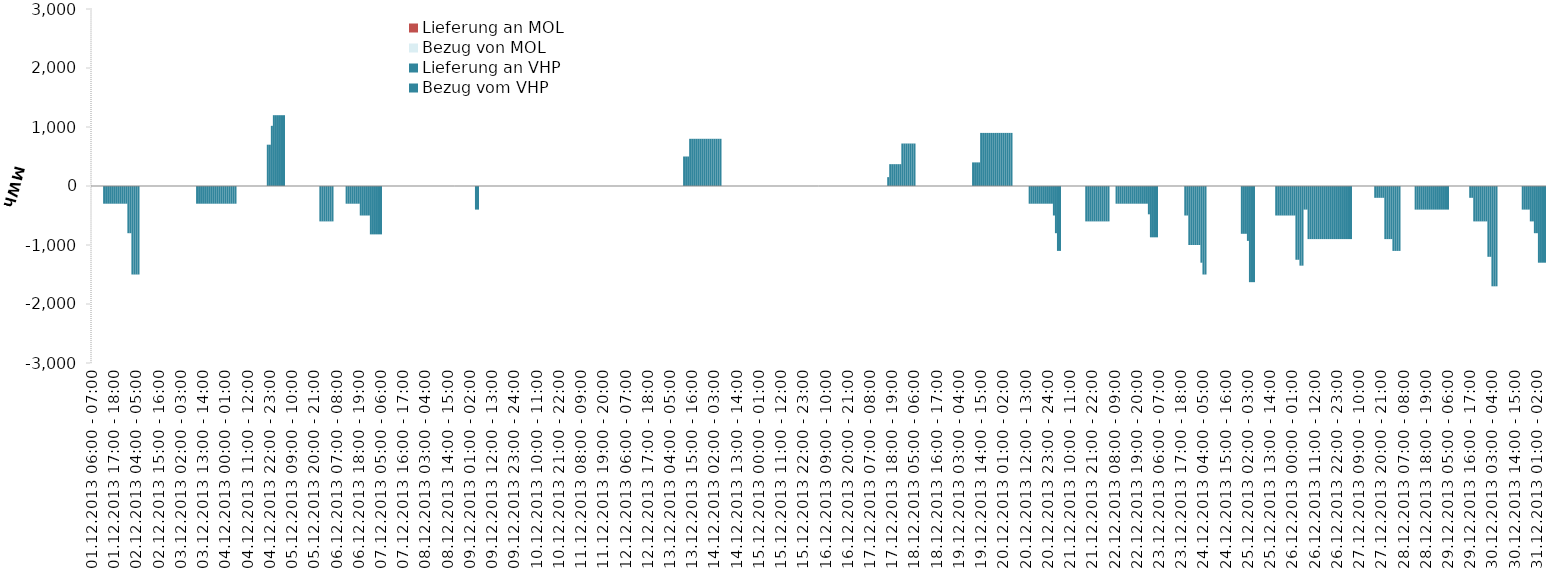
| Category | Bezug vom VHP | Lieferung an VHP | Bezug von MOL | Lieferung an MOL |
|---|---|---|---|---|
| 01.12.2013 06:00 - 07:00 | 0 | 0 | 0 | 0 |
| 01.12.2013 07:00 - 08:00 | 0 | 0 | 0 | 0 |
| 01.12.2013 08:00 - 09:00 | 0 | 0 | 0 | 0 |
| 01.12.2013 09:00 - 10:00 | 0 | 0 | 0 | 0 |
| 01.12.2013 10:00 - 11:00 | 0 | 0 | 0 | 0 |
| 01.12.2013 11:00 - 12:00 | 0 | 0 | 0 | 0 |
| 01.12.2013 12:00 - 13:00 | 0 | -300 | 0 | 0 |
| 01.12.2013 13:00 - 14:00 | 0 | -300 | 0 | 0 |
| 01.12.2013 14:00 - 15:00 | 0 | -300 | 0 | 0 |
| 01.12.2013 15:00 - 16:00 | 0 | -300 | 0 | 0 |
| 01.12.2013 16:00 - 17:00 | 0 | -300 | 0 | 0 |
| 01.12.2013 17:00 - 18:00 | 0 | -300 | 0 | 0 |
| 01.12.2013 18:00 - 19:00 | 0 | -300 | 0 | 0 |
| 01.12.2013 19:00 - 20:00 | 0 | -300 | 0 | 0 |
| 01.12.2013 20:00 - 21:00 | 0 | -300 | 0 | 0 |
| 01.12.2013 21:00 - 22:00 | 0 | -300 | 0 | 0 |
| 01.12.2013 22:00 - 23:00 | 0 | -300 | 0 | 0 |
| 01.12.2013 23:00 - 24:00 | 0 | -300 | 0 | 0 |
| 02.12.2013 00:00 - 01:00 | 0 | -800 | 0 | 0 |
| 02.12.2013 01:00 - 02:00 | 0 | -800 | 0 | 0 |
| 02.12.2013 02:00 - 03:00 | 0 | -1500 | 0 | 0 |
| 02.12.2013 03:00 - 04:00 | 0 | -1500 | 0 | 0 |
| 02.12.2013 04:00 - 05:00 | 0 | -1500 | 0 | 0 |
| 02.12.2013 05:00 - 06:00 | 0 | -1500 | 0 | 0 |
| 02.12.2013 06:00 - 07:00 | 0 | 0 | 0 | 0 |
| 02.12.2013 07:00 - 08:00 | 0 | 0 | 0 | 0 |
| 02.12.2013 08:00 - 09:00 | 0 | 0 | 0 | 0 |
| 02.12.2013 09:00 - 10:00 | 0 | 0 | 0 | 0 |
| 02.12.2013 10:00 - 11:00 | 0 | 0 | 0 | 0 |
| 02.12.2013 11:00 - 12:00 | 0 | 0 | 0 | 0 |
| 02.12.2013 12:00 - 13:00 | 0 | 0 | 0 | 0 |
| 02.12.2013 13:00 - 14:00 | 0 | 0 | 0 | 0 |
| 02.12.2013 14:00 - 15:00 | 0 | 0 | 0 | 0 |
| 02.12.2013 15:00 - 16:00 | 0 | 0 | 0 | 0 |
| 02.12.2013 16:00 - 17:00 | 0 | 0 | 0 | 0 |
| 02.12.2013 17:00 - 18:00 | 0 | 0 | 0 | 0 |
| 02.12.2013 18:00 - 19:00 | 0 | 0 | 0 | 0 |
| 02.12.2013 19:00 - 20:00 | 0 | 0 | 0 | 0 |
| 02.12.2013 20:00 - 21:00 | 0 | 0 | 0 | 0 |
| 02.12.2013 21:00 - 22:00 | 0 | 0 | 0 | 0 |
| 02.12.2013 22:00 - 23:00 | 0 | 0 | 0 | 0 |
| 02.12.2013 23:00 - 24:00 | 0 | 0 | 0 | 0 |
| 03.12.2013 00:00 - 01:00 | 0 | 0 | 0 | 0 |
| 03.12.2013 01:00 - 02:00 | 0 | 0 | 0 | 0 |
| 03.12.2013 02:00 - 03:00 | 0 | 0 | 0 | 0 |
| 03.12.2013 03:00 - 04:00 | 0 | 0 | 0 | 0 |
| 03.12.2013 04:00 - 05:00 | 0 | 0 | 0 | 0 |
| 03.12.2013 05:00 - 06:00 | 0 | 0 | 0 | 0 |
| 03.12.2013 06:00 - 07:00 | 0 | 0 | 0 | 0 |
| 03.12.2013 07:00 - 08:00 | 0 | 0 | 0 | 0 |
| 03.12.2013 08:00 - 09:00 | 0 | 0 | 0 | 0 |
| 03.12.2013 09:00 - 10:00 | 0 | 0 | 0 | 0 |
| 03.12.2013 10:00 - 11:00 | 0 | -300 | 0 | 0 |
| 03.12.2013 11:00 - 12:00 | 0 | -300 | 0 | 0 |
| 03.12.2013 12:00 - 13:00 | 0 | -300 | 0 | 0 |
| 03.12.2013 13:00 - 14:00 | 0 | -300 | 0 | 0 |
| 03.12.2013 14:00 - 15:00 | 0 | -300 | 0 | 0 |
| 03.12.2013 15:00 - 16:00 | 0 | -300 | 0 | 0 |
| 03.12.2013 16:00 - 17:00 | 0 | -300 | 0 | 0 |
| 03.12.2013 17:00 - 18:00 | 0 | -300 | 0 | 0 |
| 03.12.2013 18:00 - 19:00 | 0 | -300 | 0 | 0 |
| 03.12.2013 19:00 - 20:00 | 0 | -300 | 0 | 0 |
| 03.12.2013 20:00 - 21:00 | 0 | -300 | 0 | 0 |
| 03.12.2013 21:00 - 22:00 | 0 | -300 | 0 | 0 |
| 03.12.2013 22:00 - 23:00 | 0 | -300 | 0 | 0 |
| 03.12.2013 23:00 - 24:00 | 0 | -300 | 0 | 0 |
| 04.12.2013 00:00 - 01:00 | 0 | -300 | 0 | 0 |
| 04.12.2013 01:00 - 02:00 | 0 | -300 | 0 | 0 |
| 04.12.2013 02:00 - 03:00 | 0 | -300 | 0 | 0 |
| 04.12.2013 03:00 - 04:00 | 0 | -300 | 0 | 0 |
| 04.12.2013 04:00 - 05:00 | 0 | -300 | 0 | 0 |
| 04.12.2013 05:00 - 06:00 | 0 | -300 | 0 | 0 |
| 04.12.2013 06:00 - 07:00 | 0 | 0 | 0 | 0 |
| 04.12.2013 07:00 - 08:00 | 0 | 0 | 0 | 0 |
| 04.12.2013 08:00 - 09:00 | 0 | 0 | 0 | 0 |
| 04.12.2013 09:00 - 10:00 | 0 | 0 | 0 | 0 |
| 04.12.2013 10:00 - 11:00 | 0 | 0 | 0 | 0 |
| 04.12.2013 11:00 - 12:00 | 0 | 0 | 0 | 0 |
| 04.12.2013 12:00 - 13:00 | 0 | 0 | 0 | 0 |
| 04.12.2013 13:00 - 14:00 | 0 | 0 | 0 | 0 |
| 04.12.2013 14:00 - 15:00 | 0 | 0 | 0 | 0 |
| 04.12.2013 15:00 - 16:00 | 0 | 0 | 0 | 0 |
| 04.12.2013 16:00 - 17:00 | 0 | 0 | 0 | 0 |
| 04.12.2013 17:00 - 18:00 | 0 | 0 | 0 | 0 |
| 04.12.2013 18:00 - 19:00 | 0 | 0 | 0 | 0 |
| 04.12.2013 19:00 - 20:00 | 0 | 0 | 0 | 0 |
| 04.12.2013 20:00 - 21:00 | 0 | 0 | 0 | 0 |
| 04.12.2013 21:00 - 22:00 | 700 | 0 | 0 | 0 |
| 04.12.2013 22:00 - 23:00 | 700 | 0 | 0 | 0 |
| 04.12.2013 23:00 - 24:00 | 1020 | 0 | 0 | 0 |
| 05.12.2013 00:00 - 01:00 | 1200 | 0 | 0 | 0 |
| 05.12.2013 01:00 - 02:00 | 1200 | 0 | 0 | 0 |
| 05.12.2013 02:00 - 03:00 | 1200 | 0 | 0 | 0 |
| 05.12.2013 03:00 - 04:00 | 1200 | 0 | 0 | 0 |
| 05.12.2013 04:00 - 05:00 | 1200 | 0 | 0 | 0 |
| 05.12.2013 05:00 - 06:00 | 1200 | 0 | 0 | 0 |
| 05.12.2013 06:00 - 07:00 | 0 | 0 | 0 | 0 |
| 05.12.2013 07:00 - 08:00 | 0 | 0 | 0 | 0 |
| 05.12.2013 08:00 - 09:00 | 0 | 0 | 0 | 0 |
| 05.12.2013 09:00 - 10:00 | 0 | 0 | 0 | 0 |
| 05.12.2013 10:00 - 11:00 | 0 | 0 | 0 | 0 |
| 05.12.2013 11:00 - 12:00 | 0 | 0 | 0 | 0 |
| 05.12.2013 12:00 - 13:00 | 0 | 0 | 0 | 0 |
| 05.12.2013 13:00 - 14:00 | 0 | 0 | 0 | 0 |
| 05.12.2013 14:00 - 15:00 | 0 | 0 | 0 | 0 |
| 05.12.2013 15:00 - 16:00 | 0 | 0 | 0 | 0 |
| 05.12.2013 16:00 - 17:00 | 0 | 0 | 0 | 0 |
| 05.12.2013 17:00 - 18:00 | 0 | 0 | 0 | 0 |
| 05.12.2013 18:00 - 19:00 | 0 | 0 | 0 | 0 |
| 05.12.2013 19:00 - 20:00 | 0 | 0 | 0 | 0 |
| 05.12.2013 20:00 - 21:00 | 0 | 0 | 0 | 0 |
| 05.12.2013 21:00 - 22:00 | 0 | 0 | 0 | 0 |
| 05.12.2013 22:00 - 23:00 | 0 | 0 | 0 | 0 |
| 05.12.2013 23:00 - 24:00 | 0 | -600 | 0 | 0 |
| 06.12.2013 00:00 - 01:00 | 0 | -600 | 0 | 0 |
| 06.12.2013 01:00 - 02:00 | 0 | -600 | 0 | 0 |
| 06.12.2013 02:00 - 03:00 | 0 | -600 | 0 | 0 |
| 06.12.2013 03:00 - 04:00 | 0 | -600 | 0 | 0 |
| 06.12.2013 04:00 - 05:00 | 0 | -600 | 0 | 0 |
| 06.12.2013 05:00 - 06:00 | 0 | -600 | 0 | 0 |
| 06.12.2013 06:00 - 07:00 | 0 | 0 | 0 | 0 |
| 06.12.2013 07:00 - 08:00 | 0 | 0 | 0 | 0 |
| 06.12.2013 08:00 - 09:00 | 0 | 0 | 0 | 0 |
| 06.12.2013 09:00 - 10:00 | 0 | 0 | 0 | 0 |
| 06.12.2013 10:00 - 11:00 | 0 | 0 | 0 | 0 |
| 06.12.2013 11:00 - 12:00 | 0 | 0 | 0 | 0 |
| 06.12.2013 12:00 - 13:00 | 0 | -300 | 0 | 0 |
| 06.12.2013 13:00 - 14:00 | 0 | -300 | 0 | 0 |
| 06.12.2013 14:00 - 15:00 | 0 | -300 | 0 | 0 |
| 06.12.2013 15:00 - 16:00 | 0 | -300 | 0 | 0 |
| 06.12.2013 16:00 - 17:00 | 0 | -300 | 0 | 0 |
| 06.12.2013 17:00 - 18:00 | 0 | -300 | 0 | 0 |
| 06.12.2013 18:00 - 19:00 | 0 | -300 | 0 | 0 |
| 06.12.2013 19:00 - 20:00 | 0 | -500 | 0 | 0 |
| 06.12.2013 20:00 - 21:00 | 0 | -500 | 0 | 0 |
| 06.12.2013 21:00 - 22:00 | 0 | -500 | 0 | 0 |
| 06.12.2013 22:00 - 23:00 | 0 | -500 | 0 | 0 |
| 06.12.2013 23:00 - 24:00 | 0 | -500 | 0 | 0 |
| 07.12.2013 00:00 - 01:00 | 0 | -820 | 0 | 0 |
| 07.12.2013 01:00 - 02:00 | 0 | -820 | 0 | 0 |
| 07.12.2013 02:00 - 03:00 | 0 | -820 | 0 | 0 |
| 07.12.2013 03:00 - 04:00 | 0 | -820 | 0 | 0 |
| 07.12.2013 04:00 - 05:00 | 0 | -820 | 0 | 0 |
| 07.12.2013 05:00 - 06:00 | 0 | -820 | 0 | 0 |
| 07.12.2013 06:00 - 07:00 | 0 | 0 | 0 | 0 |
| 07.12.2013 07:00 - 08:00 | 0 | 0 | 0 | 0 |
| 07.12.2013 08:00 - 09:00 | 0 | 0 | 0 | 0 |
| 07.12.2013 09:00 - 10:00 | 0 | 0 | 0 | 0 |
| 07.12.2013 10:00 - 11:00 | 0 | 0 | 0 | 0 |
| 07.12.2013 11:00 - 12:00 | 0 | 0 | 0 | 0 |
| 07.12.2013 12:00 - 13:00 | 0 | 0 | 0 | 0 |
| 07.12.2013 13:00 - 14:00 | 0 | 0 | 0 | 0 |
| 07.12.2013 14:00 - 15:00 | 0 | 0 | 0 | 0 |
| 07.12.2013 15:00 - 16:00 | 0 | 0 | 0 | 0 |
| 07.12.2013 16:00 - 17:00 | 0 | 0 | 0 | 0 |
| 07.12.2013 17:00 - 18:00 | 0 | 0 | 0 | 0 |
| 07.12.2013 18:00 - 19:00 | 0 | 0 | 0 | 0 |
| 07.12.2013 19:00 - 20:00 | 0 | 0 | 0 | 0 |
| 07.12.2013 20:00 - 21:00 | 0 | 0 | 0 | 0 |
| 07.12.2013 21:00 - 22:00 | 0 | 0 | 0 | 0 |
| 07.12.2013 22:00 - 23:00 | 0 | 0 | 0 | 0 |
| 07.12.2013 23:00 - 24:00 | 0 | 0 | 0 | 0 |
| 08.12.2013 00:00 - 01:00 | 0 | 0 | 0 | 0 |
| 08.12.2013 01:00 - 02:00 | 0 | 0 | 0 | 0 |
| 08.12.2013 02:00 - 03:00 | 0 | 0 | 0 | 0 |
| 08.12.2013 03:00 - 04:00 | 0 | 0 | 0 | 0 |
| 08.12.2013 04:00 - 05:00 | 0 | 0 | 0 | 0 |
| 08.12.2013 05:00 - 06:00 | 0 | 0 | 0 | 0 |
| 08.12.2013 06:00 - 07:00 | 0 | 0 | 0 | 0 |
| 08.12.2013 07:00 - 08:00 | 0 | 0 | 0 | 0 |
| 08.12.2013 08:00 - 09:00 | 0 | 0 | 0 | 0 |
| 08.12.2013 09:00 - 10:00 | 0 | 0 | 0 | 0 |
| 08.12.2013 10:00 - 11:00 | 0 | 0 | 0 | 0 |
| 08.12.2013 11:00 - 12:00 | 0 | 0 | 0 | 0 |
| 08.12.2013 12:00 - 13:00 | 0 | 0 | 0 | 0 |
| 08.12.2013 13:00 - 14:00 | 0 | 0 | 0 | 0 |
| 08.12.2013 14:00 - 15:00 | 0 | 0 | 0 | 0 |
| 08.12.2013 15:00 - 16:00 | 0 | 0 | 0 | 0 |
| 08.12.2013 16:00 - 17:00 | 0 | 0 | 0 | 0 |
| 08.12.2013 17:00 - 18:00 | 0 | 0 | 0 | 0 |
| 08.12.2013 18:00 - 19:00 | 0 | 0 | 0 | 0 |
| 08.12.2013 19:00 - 20:00 | 0 | 0 | 0 | 0 |
| 08.12.2013 20:00 - 21:00 | 0 | 0 | 0 | 0 |
| 08.12.2013 21:00 - 22:00 | 0 | 0 | 0 | 0 |
| 08.12.2013 22:00 - 23:00 | 0 | 0 | 0 | 0 |
| 08.12.2013 23:00 - 24:00 | 0 | 0 | 0 | 0 |
| 09.12.2013 00:00 - 01:00 | 0 | 0 | 0 | 0 |
| 09.12.2013 01:00 - 02:00 | 0 | 0 | 0 | 0 |
| 09.12.2013 02:00 - 03:00 | 0 | 0 | 0 | 0 |
| 09.12.2013 03:00 - 04:00 | 0 | 0 | 0 | 0 |
| 09.12.2013 04:00 - 05:00 | 0 | -400 | 0 | 0 |
| 09.12.2013 05:00 - 06:00 | 0 | -400 | 0 | 0 |
| 09.12.2013 06:00 - 07:00 | 0 | 0 | 0 | 0 |
| 09.12.2013 07:00 - 08:00 | 0 | 0 | 0 | 0 |
| 09.12.2013 08:00 - 09:00 | 0 | 0 | 0 | 0 |
| 09.12.2013 09:00 - 10:00 | 0 | 0 | 0 | 0 |
| 09.12.2013 10:00 - 11:00 | 0 | 0 | 0 | 0 |
| 09.12.2013 11:00 - 12:00 | 0 | 0 | 0 | 0 |
| 09.12.2013 12:00 - 13:00 | 0 | 0 | 0 | 0 |
| 09.12.2013 13:00 - 14:00 | 0 | 0 | 0 | 0 |
| 09.12.2013 14:00 - 15:00 | 0 | 0 | 0 | 0 |
| 09.12.2013 15:00 - 16:00 | 0 | 0 | 0 | 0 |
| 09.12.2013 16:00 - 17:00 | 0 | 0 | 0 | 0 |
| 09.12.2013 17:00 - 18:00 | 0 | 0 | 0 | 0 |
| 09.12.2013 18:00 - 19:00 | 0 | 0 | 0 | 0 |
| 09.12.2013 19:00 - 20:00 | 0 | 0 | 0 | 0 |
| 09.12.2013 20:00 - 21:00 | 0 | 0 | 0 | 0 |
| 09.12.2013 21:00 - 22:00 | 0 | 0 | 0 | 0 |
| 09.12.2013 22:00 - 23:00 | 0 | 0 | 0 | 0 |
| 09.12.2013 23:00 - 24:00 | 0 | 0 | 0 | 0 |
| 10.12.2013 00:00 - 01:00 | 0 | 0 | 0 | 0 |
| 10.12.2013 01:00 - 02:00 | 0 | 0 | 0 | 0 |
| 10.12.2013 02:00 - 03:00 | 0 | 0 | 0 | 0 |
| 10.12.2013 03:00 - 04:00 | 0 | 0 | 0 | 0 |
| 10.12.2013 04:00 - 05:00 | 0 | 0 | 0 | 0 |
| 10.12.2013 05:00 - 06:00 | 0 | 0 | 0 | 0 |
| 10.12.2013 06:00 - 07:00 | 0 | 0 | 0 | 0 |
| 10.12.2013 07:00 - 08:00 | 0 | 0 | 0 | 0 |
| 10.12.2013 08:00 - 09:00 | 0 | 0 | 0 | 0 |
| 10.12.2013 09:00 - 10:00 | 0 | 0 | 0 | 0 |
| 10.12.2013 10:00 - 11:00 | 0 | 0 | 0 | 0 |
| 10.12.2013 11:00 - 12:00 | 0 | 0 | 0 | 0 |
| 10.12.2013 12:00 - 13:00 | 0 | 0 | 0 | 0 |
| 10.12.2013 13:00 - 14:00 | 0 | 0 | 0 | 0 |
| 10.12.2013 14:00 - 15:00 | 0 | 0 | 0 | 0 |
| 10.12.2013 15:00 - 16:00 | 0 | 0 | 0 | 0 |
| 10.12.2013 16:00 - 17:00 | 0 | 0 | 0 | 0 |
| 10.12.2013 17:00 - 18:00 | 0 | 0 | 0 | 0 |
| 10.12.2013 18:00 - 19:00 | 0 | 0 | 0 | 0 |
| 10.12.2013 19:00 - 20:00 | 0 | 0 | 0 | 0 |
| 10.12.2013 20:00 - 21:00 | 0 | 0 | 0 | 0 |
| 10.12.2013 21:00 - 22:00 | 0 | 0 | 0 | 0 |
| 10.12.2013 22:00 - 23:00 | 0 | 0 | 0 | 0 |
| 10.12.2013 23:00 - 24:00 | 0 | 0 | 0 | 0 |
| 11.12.2013 00:00 - 01:00 | 0 | 0 | 0 | 0 |
| 11.12.2013 01:00 - 02:00 | 0 | 0 | 0 | 0 |
| 11.12.2013 02:00 - 03:00 | 0 | 0 | 0 | 0 |
| 11.12.2013 03:00 - 04:00 | 0 | 0 | 0 | 0 |
| 11.12.2013 04:00 - 05:00 | 0 | 0 | 0 | 0 |
| 11.12.2013 05:00 - 06:00 | 0 | 0 | 0 | 0 |
| 11.12.2013 06:00 - 07:00 | 0 | 0 | 0 | 0 |
| 11.12.2013 07:00 - 08:00 | 0 | 0 | 0 | 0 |
| 11.12.2013 08:00 - 09:00 | 0 | 0 | 0 | 0 |
| 11.12.2013 09:00 - 10:00 | 0 | 0 | 0 | 0 |
| 11.12.2013 10:00 - 11:00 | 0 | 0 | 0 | 0 |
| 11.12.2013 11:00 - 12:00 | 0 | 0 | 0 | 0 |
| 11.12.2013 12:00 - 13:00 | 0 | 0 | 0 | 0 |
| 11.12.2013 13:00 - 14:00 | 0 | 0 | 0 | 0 |
| 11.12.2013 14:00 - 15:00 | 0 | 0 | 0 | 0 |
| 11.12.2013 15:00 - 16:00 | 0 | 0 | 0 | 0 |
| 11.12.2013 16:00 - 17:00 | 0 | 0 | 0 | 0 |
| 11.12.2013 17:00 - 18:00 | 0 | 0 | 0 | 0 |
| 11.12.2013 18:00 - 19:00 | 0 | 0 | 0 | 0 |
| 11.12.2013 19:00 - 20:00 | 0 | 0 | 0 | 0 |
| 11.12.2013 20:00 - 21:00 | 0 | 0 | 0 | 0 |
| 11.12.2013 21:00 - 22:00 | 0 | 0 | 0 | 0 |
| 11.12.2013 22:00 - 23:00 | 0 | 0 | 0 | 0 |
| 11.12.2013 23:00 - 24:00 | 0 | 0 | 0 | 0 |
| 12.12.2013 00:00 - 01:00 | 0 | 0 | 0 | 0 |
| 12.12.2013 01:00 - 02:00 | 0 | 0 | 0 | 0 |
| 12.12.2013 02:00 - 03:00 | 0 | 0 | 0 | 0 |
| 12.12.2013 03:00 - 04:00 | 0 | 0 | 0 | 0 |
| 12.12.2013 04:00 - 05:00 | 0 | 0 | 0 | 0 |
| 12.12.2013 05:00 - 06:00 | 0 | 0 | 0 | 0 |
| 12.12.2013 06:00 - 07:00 | 0 | 0 | 0 | 0 |
| 12.12.2013 07:00 - 08:00 | 0 | 0 | 0 | 0 |
| 12.12.2013 08:00 - 09:00 | 0 | 0 | 0 | 0 |
| 12.12.2013 09:00 - 10:00 | 0 | 0 | 0 | 0 |
| 12.12.2013 10:00 - 11:00 | 0 | 0 | 0 | 0 |
| 12.12.2013 11:00 - 12:00 | 0 | 0 | 0 | 0 |
| 12.12.2013 12:00 - 13:00 | 0 | 0 | 0 | 0 |
| 12.12.2013 13:00 - 14:00 | 0 | 0 | 0 | 0 |
| 12.12.2013 14:00 - 15:00 | 0 | 0 | 0 | 0 |
| 12.12.2013 15:00 - 16:00 | 0 | 0 | 0 | 0 |
| 12.12.2013 16:00 - 17:00 | 0 | 0 | 0 | 0 |
| 12.12.2013 17:00 - 18:00 | 0 | 0 | 0 | 0 |
| 12.12.2013 18:00 - 19:00 | 0 | 0 | 0 | 0 |
| 12.12.2013 19:00 - 20:00 | 0 | 0 | 0 | 0 |
| 12.12.2013 20:00 - 21:00 | 0 | 0 | 0 | 0 |
| 12.12.2013 21:00 - 22:00 | 0 | 0 | 0 | 0 |
| 12.12.2013 22:00 - 23:00 | 0 | 0 | 0 | 0 |
| 12.12.2013 23:00 - 24:00 | 0 | 0 | 0 | 0 |
| 13.12.2013 00:00 - 01:00 | 0 | 0 | 0 | 0 |
| 13.12.2013 01:00 - 02:00 | 0 | 0 | 0 | 0 |
| 13.12.2013 02:00 - 03:00 | 0 | 0 | 0 | 0 |
| 13.12.2013 03:00 - 04:00 | 0 | 0 | 0 | 0 |
| 13.12.2013 04:00 - 05:00 | 0 | 0 | 0 | 0 |
| 13.12.2013 05:00 - 06:00 | 0 | 0 | 0 | 0 |
| 13.12.2013 06:00 - 07:00 | 0 | 0 | 0 | 0 |
| 13.12.2013 07:00 - 08:00 | 0 | 0 | 0 | 0 |
| 13.12.2013 08:00 - 09:00 | 0 | 0 | 0 | 0 |
| 13.12.2013 09:00 - 10:00 | 0 | 0 | 0 | 0 |
| 13.12.2013 10:00 - 11:00 | 0 | 0 | 0 | 0 |
| 13.12.2013 11:00 - 12:00 | 500 | 0 | 0 | 0 |
| 13.12.2013 12:00 - 13:00 | 500 | 0 | 0 | 0 |
| 13.12.2013 13:00 - 14:00 | 500 | 0 | 0 | 0 |
| 13.12.2013 14:00 - 15:00 | 800 | 0 | 0 | 0 |
| 13.12.2013 15:00 - 16:00 | 800 | 0 | 0 | 0 |
| 13.12.2013 16:00 - 17:00 | 800 | 0 | 0 | 0 |
| 13.12.2013 17:00 - 18:00 | 800 | 0 | 0 | 0 |
| 13.12.2013 18:00 - 19:00 | 800 | 0 | 0 | 0 |
| 13.12.2013 19:00 - 20:00 | 800 | 0 | 0 | 0 |
| 13.12.2013 20:00 - 21:00 | 800 | 0 | 0 | 0 |
| 13.12.2013 21:00 - 22:00 | 800 | 0 | 0 | 0 |
| 13.12.2013 22:00 - 23:00 | 800 | 0 | 0 | 0 |
| 13.12.2013 23:00 - 24:00 | 800 | 0 | 0 | 0 |
| 14.12.2013 00:00 - 01:00 | 800 | 0 | 0 | 0 |
| 14.12.2013 01:00 - 02:00 | 800 | 0 | 0 | 0 |
| 14.12.2013 02:00 - 03:00 | 800 | 0 | 0 | 0 |
| 14.12.2013 03:00 - 04:00 | 800 | 0 | 0 | 0 |
| 14.12.2013 04:00 - 05:00 | 800 | 0 | 0 | 0 |
| 14.12.2013 05:00 - 06:00 | 800 | 0 | 0 | 0 |
| 14.12.2013 06:00 - 07:00 | 0 | 0 | 0 | 0 |
| 14.12.2013 07:00 - 08:00 | 0 | 0 | 0 | 0 |
| 14.12.2013 08:00 - 09:00 | 0 | 0 | 0 | 0 |
| 14.12.2013 09:00 - 10:00 | 0 | 0 | 0 | 0 |
| 14.12.2013 10:00 - 11:00 | 0 | 0 | 0 | 0 |
| 14.12.2013 11:00 - 12:00 | 0 | 0 | 0 | 0 |
| 14.12.2013 12:00 - 13:00 | 0 | 0 | 0 | 0 |
| 14.12.2013 13:00 - 14:00 | 0 | 0 | 0 | 0 |
| 14.12.2013 14:00 - 15:00 | 0 | 0 | 0 | 0 |
| 14.12.2013 15:00 - 16:00 | 0 | 0 | 0 | 0 |
| 14.12.2013 16:00 - 17:00 | 0 | 0 | 0 | 0 |
| 14.12.2013 17:00 - 18:00 | 0 | 0 | 0 | 0 |
| 14.12.2013 18:00 - 19:00 | 0 | 0 | 0 | 0 |
| 14.12.2013 19:00 - 20:00 | 0 | 0 | 0 | 0 |
| 14.12.2013 20:00 - 21:00 | 0 | 0 | 0 | 0 |
| 14.12.2013 21:00 - 22:00 | 0 | 0 | 0 | 0 |
| 14.12.2013 22:00 - 23:00 | 0 | 0 | 0 | 0 |
| 14.12.2013 23:00 - 24:00 | 0 | 0 | 0 | 0 |
| 15.12.2013 00:00 - 01:00 | 0 | 0 | 0 | 0 |
| 15.12.2013 01:00 - 02:00 | 0 | 0 | 0 | 0 |
| 15.12.2013 02:00 - 03:00 | 0 | 0 | 0 | 0 |
| 15.12.2013 03:00 - 04:00 | 0 | 0 | 0 | 0 |
| 15.12.2013 04:00 - 05:00 | 0 | 0 | 0 | 0 |
| 15.12.2013 05:00 - 06:00 | 0 | 0 | 0 | 0 |
| 15.12.2013 06:00 - 07:00 | 0 | 0 | 0 | 0 |
| 15.12.2013 07:00 - 08:00 | 0 | 0 | 0 | 0 |
| 15.12.2013 08:00 - 09:00 | 0 | 0 | 0 | 0 |
| 15.12.2013 09:00 - 10:00 | 0 | 0 | 0 | 0 |
| 15.12.2013 10:00 - 11:00 | 0 | 0 | 0 | 0 |
| 15.12.2013 11:00 - 12:00 | 0 | 0 | 0 | 0 |
| 15.12.2013 12:00 - 13:00 | 0 | 0 | 0 | 0 |
| 15.12.2013 13:00 - 14:00 | 0 | 0 | 0 | 0 |
| 15.12.2013 14:00 - 15:00 | 0 | 0 | 0 | 0 |
| 15.12.2013 15:00 - 16:00 | 0 | 0 | 0 | 0 |
| 15.12.2013 16:00 - 17:00 | 0 | 0 | 0 | 0 |
| 15.12.2013 17:00 - 18:00 | 0 | 0 | 0 | 0 |
| 15.12.2013 18:00 - 19:00 | 0 | 0 | 0 | 0 |
| 15.12.2013 19:00 - 20:00 | 0 | 0 | 0 | 0 |
| 15.12.2013 20:00 - 21:00 | 0 | 0 | 0 | 0 |
| 15.12.2013 21:00 - 22:00 | 0 | 0 | 0 | 0 |
| 15.12.2013 22:00 - 23:00 | 0 | 0 | 0 | 0 |
| 15.12.2013 23:00 - 24:00 | 0 | 0 | 0 | 0 |
| 16.12.2013 00:00 - 01:00 | 0 | 0 | 0 | 0 |
| 16.12.2013 01:00 - 02:00 | 0 | 0 | 0 | 0 |
| 16.12.2013 02:00 - 03:00 | 0 | 0 | 0 | 0 |
| 16.12.2013 03:00 - 04:00 | 0 | 0 | 0 | 0 |
| 16.12.2013 04:00 - 05:00 | 0 | 0 | 0 | 0 |
| 16.12.2013 05:00 - 06:00 | 0 | 0 | 0 | 0 |
| 16.12.2013 06:00 - 07:00 | 0 | 0 | 0 | 0 |
| 16.12.2013 07:00 - 08:00 | 0 | 0 | 0 | 0 |
| 16.12.2013 08:00 - 09:00 | 0 | 0 | 0 | 0 |
| 16.12.2013 09:00 - 10:00 | 0 | 0 | 0 | 0 |
| 16.12.2013 10:00 - 11:00 | 0 | 0 | 0 | 0 |
| 16.12.2013 11:00 - 12:00 | 0 | 0 | 0 | 0 |
| 16.12.2013 12:00 - 13:00 | 0 | 0 | 0 | 0 |
| 16.12.2013 13:00 - 14:00 | 0 | 0 | 0 | 0 |
| 16.12.2013 14:00 - 15:00 | 0 | 0 | 0 | 0 |
| 16.12.2013 15:00 - 16:00 | 0 | 0 | 0 | 0 |
| 16.12.2013 16:00 - 17:00 | 0 | 0 | 0 | 0 |
| 16.12.2013 17:00 - 18:00 | 0 | 0 | 0 | 0 |
| 16.12.2013 18:00 - 19:00 | 0 | 0 | 0 | 0 |
| 16.12.2013 19:00 - 20:00 | 0 | 0 | 0 | 0 |
| 16.12.2013 20:00 - 21:00 | 0 | 0 | 0 | 0 |
| 16.12.2013 21:00 - 22:00 | 0 | 0 | 0 | 0 |
| 16.12.2013 22:00 - 23:00 | 0 | 0 | 0 | 0 |
| 16.12.2013 23:00 - 24:00 | 0 | 0 | 0 | 0 |
| 17.12.2013 00:00 - 01:00 | 0 | 0 | 0 | 0 |
| 17.12.2013 01:00 - 02:00 | 0 | 0 | 0 | 0 |
| 17.12.2013 02:00 - 03:00 | 0 | 0 | 0 | 0 |
| 17.12.2013 03:00 - 04:00 | 0 | 0 | 0 | 0 |
| 17.12.2013 04:00 - 05:00 | 0 | 0 | 0 | 0 |
| 17.12.2013 05:00 - 06:00 | 0 | 0 | 0 | 0 |
| 17.12.2013 06:00 - 07:00 | 0 | 0 | 0 | 0 |
| 17.12.2013 07:00 - 08:00 | 0 | 0 | 0 | 0 |
| 17.12.2013 08:00 - 09:00 | 0 | 0 | 0 | 0 |
| 17.12.2013 09:00 - 10:00 | 0 | 0 | 0 | 0 |
| 17.12.2013 10:00 - 11:00 | 0 | 0 | 0 | 0 |
| 17.12.2013 11:00 - 12:00 | 0 | 0 | 0 | 0 |
| 17.12.2013 12:00 - 13:00 | 0 | 0 | 0 | 0 |
| 17.12.2013 13:00 - 14:00 | 0 | 0 | 0 | 0 |
| 17.12.2013 14:00 - 15:00 | 0 | 0 | 0 | 0 |
| 17.12.2013 15:00 - 16:00 | 0 | 0 | 0 | 0 |
| 17.12.2013 16:00 - 17:00 | 150 | 0 | 0 | 0 |
| 17.12.2013 17:00 - 18:00 | 370 | 0 | 0 | 0 |
| 17.12.2013 18:00 - 19:00 | 370 | 0 | 0 | 0 |
| 17.12.2013 19:00 - 20:00 | 370 | 0 | 0 | 0 |
| 17.12.2013 20:00 - 21:00 | 370 | 0 | 0 | 0 |
| 17.12.2013 21:00 - 22:00 | 370 | 0 | 0 | 0 |
| 17.12.2013 22:00 - 23:00 | 370 | 0 | 0 | 0 |
| 17.12.2013 23:00 - 24:00 | 720 | 0 | 0 | 0 |
| 18.12.2013 00:00 - 01:00 | 720 | 0 | 0 | 0 |
| 18.12.2013 01:00 - 02:00 | 720 | 0 | 0 | 0 |
| 18.12.2013 02:00 - 03:00 | 720 | 0 | 0 | 0 |
| 18.12.2013 03:00 - 04:00 | 720 | 0 | 0 | 0 |
| 18.12.2013 04:00 - 05:00 | 720 | 0 | 0 | 0 |
| 18.12.2013 05:00 - 06:00 | 720 | 0 | 0 | 0 |
| 18.12.2013 06:00 - 07:00 | 0 | 0 | 0 | 0 |
| 18.12.2013 07:00 - 08:00 | 0 | 0 | 0 | 0 |
| 18.12.2013 08:00 - 09:00 | 0 | 0 | 0 | 0 |
| 18.12.2013 09:00 - 10:00 | 0 | 0 | 0 | 0 |
| 18.12.2013 10:00 - 11:00 | 0 | 0 | 0 | 0 |
| 18.12.2013 11:00 - 12:00 | 0 | 0 | 0 | 0 |
| 18.12.2013 12:00 - 13:00 | 0 | 0 | 0 | 0 |
| 18.12.2013 13:00 - 14:00 | 0 | 0 | 0 | 0 |
| 18.12.2013 14:00 - 15:00 | 0 | 0 | 0 | 0 |
| 18.12.2013 15:00 - 16:00 | 0 | 0 | 0 | 0 |
| 18.12.2013 16:00 - 17:00 | 0 | 0 | 0 | 0 |
| 18.12.2013 17:00 - 18:00 | 0 | 0 | 0 | 0 |
| 18.12.2013 18:00 - 19:00 | 0 | 0 | 0 | 0 |
| 18.12.2013 19:00 - 20:00 | 0 | 0 | 0 | 0 |
| 18.12.2013 20:00 - 21:00 | 0 | 0 | 0 | 0 |
| 18.12.2013 21:00 - 22:00 | 0 | 0 | 0 | 0 |
| 18.12.2013 22:00 - 23:00 | 0 | 0 | 0 | 0 |
| 18.12.2013 23:00 - 24:00 | 0 | 0 | 0 | 0 |
| 19.12.2013 00:00 - 01:00 | 0 | 0 | 0 | 0 |
| 19.12.2013 01:00 - 02:00 | 0 | 0 | 0 | 0 |
| 19.12.2013 02:00 - 03:00 | 0 | 0 | 0 | 0 |
| 19.12.2013 03:00 - 04:00 | 0 | 0 | 0 | 0 |
| 19.12.2013 04:00 - 05:00 | 0 | 0 | 0 | 0 |
| 19.12.2013 05:00 - 06:00 | 0 | 0 | 0 | 0 |
| 19.12.2013 06:00 - 07:00 | 0 | 0 | 0 | 0 |
| 19.12.2013 07:00 - 08:00 | 0 | 0 | 0 | 0 |
| 19.12.2013 08:00 - 09:00 | 0 | 0 | 0 | 0 |
| 19.12.2013 09:00 - 10:00 | 0 | 0 | 0 | 0 |
| 19.12.2013 10:00 - 11:00 | 400 | 0 | 0 | 0 |
| 19.12.2013 11:00 - 12:00 | 400 | 0 | 0 | 0 |
| 19.12.2013 12:00 - 13:00 | 400 | 0 | 0 | 0 |
| 19.12.2013 13:00 - 14:00 | 400 | 0 | 0 | 0 |
| 19.12.2013 14:00 - 15:00 | 900 | 0 | 0 | 0 |
| 19.12.2013 15:00 - 16:00 | 900 | 0 | 0 | 0 |
| 19.12.2013 16:00 - 17:00 | 900 | 0 | 0 | 0 |
| 19.12.2013 17:00 - 18:00 | 900 | 0 | 0 | 0 |
| 19.12.2013 18:00 - 19:00 | 900 | 0 | 0 | 0 |
| 19.12.2013 19:00 - 20:00 | 900 | 0 | 0 | 0 |
| 19.12.2013 20:00 - 21:00 | 900 | 0 | 0 | 0 |
| 19.12.2013 21:00 - 22:00 | 900 | 0 | 0 | 0 |
| 19.12.2013 22:00 - 23:00 | 900 | 0 | 0 | 0 |
| 19.12.2013 23:00 - 24:00 | 900 | 0 | 0 | 0 |
| 20.12.2013 00:00 - 01:00 | 900 | 0 | 0 | 0 |
| 20.12.2013 01:00 - 02:00 | 900 | 0 | 0 | 0 |
| 20.12.2013 02:00 - 03:00 | 900 | 0 | 0 | 0 |
| 20.12.2013 03:00 - 04:00 | 900 | 0 | 0 | 0 |
| 20.12.2013 04:00 - 05:00 | 900 | 0 | 0 | 0 |
| 20.12.2013 05:00 - 06:00 | 900 | 0 | 0 | 0 |
| 20.12.2013 06:00 - 07:00 | 0 | 0 | 0 | 0 |
| 20.12.2013 07:00 - 08:00 | 0 | 0 | 0 | 0 |
| 20.12.2013 08:00 - 09:00 | 0 | 0 | 0 | 0 |
| 20.12.2013 09:00 - 10:00 | 0 | 0 | 0 | 0 |
| 20.12.2013 10:00 - 11:00 | 0 | 0 | 0 | 0 |
| 20.12.2013 11:00 - 12:00 | 0 | 0 | 0 | 0 |
| 20.12.2013 12:00 - 13:00 | 0 | 0 | 0 | 0 |
| 20.12.2013 13:00 - 14:00 | 0 | 0 | 0 | 0 |
| 20.12.2013 14:00 - 15:00 | 0 | -300 | 0 | 0 |
| 20.12.2013 15:00 - 16:00 | 0 | -300 | 0 | 0 |
| 20.12.2013 16:00 - 17:00 | 0 | -300 | 0 | 0 |
| 20.12.2013 17:00 - 18:00 | 0 | -300 | 0 | 0 |
| 20.12.2013 18:00 - 19:00 | 0 | -300 | 0 | 0 |
| 20.12.2013 19:00 - 20:00 | 0 | -300 | 0 | 0 |
| 20.12.2013 20:00 - 21:00 | 0 | -300 | 0 | 0 |
| 20.12.2013 21:00 - 22:00 | 0 | -300 | 0 | 0 |
| 20.12.2013 22:00 - 23:00 | 0 | -300 | 0 | 0 |
| 20.12.2013 23:00 - 24:00 | 0 | -300 | 0 | 0 |
| 21.12.2013 00:00 - 01:00 | 0 | -300 | 0 | 0 |
| 21.12.2013 01:00 - 02:00 | 0 | -300 | 0 | 0 |
| 21.12.2013 02:00 - 03:00 | 0 | -500 | 0 | 0 |
| 21.12.2013 03:00 - 04:00 | 0 | -800 | 0 | 0 |
| 21.12.2013 04:00 - 05:00 | 0 | -1100 | 0 | 0 |
| 21.12.2013 05:00 - 06:00 | 0 | -1100 | 0 | 0 |
| 21.12.2013 06:00 - 07:00 | 0 | 0 | 0 | 0 |
| 21.12.2013 07:00 - 08:00 | 0 | 0 | 0 | 0 |
| 21.12.2013 08:00 - 09:00 | 0 | 0 | 0 | 0 |
| 21.12.2013 09:00 - 10:00 | 0 | 0 | 0 | 0 |
| 21.12.2013 10:00 - 11:00 | 0 | 0 | 0 | 0 |
| 21.12.2013 11:00 - 12:00 | 0 | 0 | 0 | 0 |
| 21.12.2013 12:00 - 13:00 | 0 | 0 | 0 | 0 |
| 21.12.2013 13:00 - 14:00 | 0 | 0 | 0 | 0 |
| 21.12.2013 14:00 - 15:00 | 0 | 0 | 0 | 0 |
| 21.12.2013 15:00 - 16:00 | 0 | 0 | 0 | 0 |
| 21.12.2013 16:00 - 17:00 | 0 | 0 | 0 | 0 |
| 21.12.2013 17:00 - 18:00 | 0 | 0 | 0 | 0 |
| 21.12.2013 18:00 - 19:00 | 0 | -600 | 0 | 0 |
| 21.12.2013 19:00 - 20:00 | 0 | -600 | 0 | 0 |
| 21.12.2013 20:00 - 21:00 | 0 | -600 | 0 | 0 |
| 21.12.2013 21:00 - 22:00 | 0 | -600 | 0 | 0 |
| 21.12.2013 22:00 - 23:00 | 0 | -600 | 0 | 0 |
| 21.12.2013 23:00 - 24:00 | 0 | -600 | 0 | 0 |
| 22.12.2013 00:00 - 01:00 | 0 | -600 | 0 | 0 |
| 22.12.2013 01:00 - 02:00 | 0 | -600 | 0 | 0 |
| 22.12.2013 02:00 - 03:00 | 0 | -600 | 0 | 0 |
| 22.12.2013 03:00 - 04:00 | 0 | -600 | 0 | 0 |
| 22.12.2013 04:00 - 05:00 | 0 | -600 | 0 | 0 |
| 22.12.2013 05:00 - 06:00 | 0 | -600 | 0 | 0 |
| 22.12.2013 06:00 - 07:00 | 0 | 0 | 0 | 0 |
| 22.12.2013 07:00 - 08:00 | 0 | 0 | 0 | 0 |
| 22.12.2013 08:00 - 09:00 | 0 | 0 | 0 | 0 |
| 22.12.2013 09:00 - 10:00 | 0 | -300 | 0 | 0 |
| 22.12.2013 10:00 - 11:00 | 0 | -300 | 0 | 0 |
| 22.12.2013 11:00 - 12:00 | 0 | -300 | 0 | 0 |
| 22.12.2013 12:00 - 13:00 | 0 | -300 | 0 | 0 |
| 22.12.2013 13:00 - 14:00 | 0 | -300 | 0 | 0 |
| 22.12.2013 14:00 - 15:00 | 0 | -300 | 0 | 0 |
| 22.12.2013 15:00 - 16:00 | 0 | -300 | 0 | 0 |
| 22.12.2013 16:00 - 17:00 | 0 | -300 | 0 | 0 |
| 22.12.2013 17:00 - 18:00 | 0 | -300 | 0 | 0 |
| 22.12.2013 18:00 - 19:00 | 0 | -300 | 0 | 0 |
| 22.12.2013 19:00 - 20:00 | 0 | -300 | 0 | 0 |
| 22.12.2013 20:00 - 21:00 | 0 | -300 | 0 | 0 |
| 22.12.2013 21:00 - 22:00 | 0 | -300 | 0 | 0 |
| 22.12.2013 22:00 - 23:00 | 0 | -300 | 0 | 0 |
| 22.12.2013 23:00 - 24:00 | 0 | -300 | 0 | 0 |
| 23.12.2013 00:00 - 01:00 | 0 | -300 | 0 | 0 |
| 23.12.2013 01:00 - 02:00 | 0 | -480 | 0 | 0 |
| 23.12.2013 02:00 - 03:00 | 0 | -870 | 0 | 0 |
| 23.12.2013 03:00 - 04:00 | 0 | -870 | 0 | 0 |
| 23.12.2013 04:00 - 05:00 | 0 | -870 | 0 | 0 |
| 23.12.2013 05:00 - 06:00 | 0 | -870 | 0 | 0 |
| 23.12.2013 06:00 - 07:00 | 0 | 0 | 0 | 0 |
| 23.12.2013 07:00 - 08:00 | 0 | 0 | 0 | 0 |
| 23.12.2013 08:00 - 09:00 | 0 | 0 | 0 | 0 |
| 23.12.2013 09:00 - 10:00 | 0 | 0 | 0 | 0 |
| 23.12.2013 10:00 - 11:00 | 0 | 0 | 0 | 0 |
| 23.12.2013 11:00 - 12:00 | 0 | 0 | 0 | 0 |
| 23.12.2013 12:00 - 13:00 | 0 | 0 | 0 | 0 |
| 23.12.2013 13:00 - 14:00 | 0 | 0 | 0 | 0 |
| 23.12.2013 14:00 - 15:00 | 0 | 0 | 0 | 0 |
| 23.12.2013 15:00 - 16:00 | 0 | 0 | 0 | 0 |
| 23.12.2013 16:00 - 17:00 | 0 | 0 | 0 | 0 |
| 23.12.2013 17:00 - 18:00 | 0 | 0 | 0 | 0 |
| 23.12.2013 18:00 - 19:00 | 0 | 0 | 0 | 0 |
| 23.12.2013 19:00 - 20:00 | 0 | -500 | 0 | 0 |
| 23.12.2013 20:00 - 21:00 | 0 | -500 | 0 | 0 |
| 23.12.2013 21:00 - 22:00 | 0 | -1000 | 0 | 0 |
| 23.12.2013 22:00 - 23:00 | 0 | -1000 | 0 | 0 |
| 23.12.2013 23:00 - 24:00 | 0 | -1000 | 0 | 0 |
| 24.12.2013 00:00 - 01:00 | 0 | -1000 | 0 | 0 |
| 24.12.2013 01:00 - 02:00 | 0 | -1000 | 0 | 0 |
| 24.12.2013 02:00 - 03:00 | 0 | -1000 | 0 | 0 |
| 24.12.2013 03:00 - 04:00 | 0 | -1300 | 0 | 0 |
| 24.12.2013 04:00 - 05:00 | 0 | -1500 | 0 | 0 |
| 24.12.2013 05:00 - 06:00 | 0 | -1500 | 0 | 0 |
| 24.12.2013 06:00 - 07:00 | 0 | 0 | 0 | 0 |
| 24.12.2013 07:00 - 08:00 | 0 | 0 | 0 | 0 |
| 24.12.2013 08:00 - 09:00 | 0 | 0 | 0 | 0 |
| 24.12.2013 09:00 - 10:00 | 0 | 0 | 0 | 0 |
| 24.12.2013 10:00 - 11:00 | 0 | 0 | 0 | 0 |
| 24.12.2013 11:00 - 12:00 | 0 | 0 | 0 | 0 |
| 24.12.2013 12:00 - 13:00 | 0 | 0 | 0 | 0 |
| 24.12.2013 13:00 - 14:00 | 0 | 0 | 0 | 0 |
| 24.12.2013 14:00 - 15:00 | 0 | 0 | 0 | 0 |
| 24.12.2013 15:00 - 16:00 | 0 | 0 | 0 | 0 |
| 24.12.2013 16:00 - 17:00 | 0 | 0 | 0 | 0 |
| 24.12.2013 17:00 - 18:00 | 0 | 0 | 0 | 0 |
| 24.12.2013 18:00 - 19:00 | 0 | 0 | 0 | 0 |
| 24.12.2013 19:00 - 20:00 | 0 | 0 | 0 | 0 |
| 24.12.2013 20:00 - 21:00 | 0 | 0 | 0 | 0 |
| 24.12.2013 21:00 - 22:00 | 0 | 0 | 0 | 0 |
| 24.12.2013 22:00 - 23:00 | 0 | 0 | 0 | 0 |
| 24.12.2013 23:00 - 24:00 | 0 | -810 | 0 | 0 |
| 25.12.2013 00:00 - 01:00 | 0 | -810 | 0 | 0 |
| 25.12.2013 01:00 - 02:00 | 0 | -810 | 0 | 0 |
| 25.12.2013 02:00 - 03:00 | 0 | -930 | 0 | 0 |
| 25.12.2013 03:00 - 04:00 | 0 | -1630 | 0 | 0 |
| 25.12.2013 04:00 - 05:00 | 0 | -1630 | 0 | 0 |
| 25.12.2013 05:00 - 06:00 | 0 | -1630 | 0 | 0 |
| 25.12.2013 06:00 - 07:00 | 0 | 0 | 0 | 0 |
| 25.12.2013 07:00 - 08:00 | 0 | 0 | 0 | 0 |
| 25.12.2013 08:00 - 09:00 | 0 | 0 | 0 | 0 |
| 25.12.2013 09:00 - 10:00 | 0 | 0 | 0 | 0 |
| 25.12.2013 10:00 - 11:00 | 0 | 0 | 0 | 0 |
| 25.12.2013 11:00 - 12:00 | 0 | 0 | 0 | 0 |
| 25.12.2013 12:00 - 13:00 | 0 | 0 | 0 | 0 |
| 25.12.2013 13:00 - 14:00 | 0 | 0 | 0 | 0 |
| 25.12.2013 14:00 - 15:00 | 0 | 0 | 0 | 0 |
| 25.12.2013 15:00 - 16:00 | 0 | 0 | 0 | 0 |
| 25.12.2013 16:00 - 17:00 | 0 | -500 | 0 | 0 |
| 25.12.2013 17:00 - 18:00 | 0 | -500 | 0 | 0 |
| 25.12.2013 18:00 - 19:00 | 0 | -500 | 0 | 0 |
| 25.12.2013 19:00 - 20:00 | 0 | -500 | 0 | 0 |
| 25.12.2013 20:00 - 21:00 | 0 | -500 | 0 | 0 |
| 25.12.2013 21:00 - 22:00 | 0 | -500 | 0 | 0 |
| 25.12.2013 22:00 - 23:00 | 0 | -500 | 0 | 0 |
| 25.12.2013 23:00 - 24:00 | 0 | -500 | 0 | 0 |
| 26.12.2013 00:00 - 01:00 | 0 | -500 | 0 | 0 |
| 26.12.2013 01:00 - 02:00 | 0 | -500 | 0 | 0 |
| 26.12.2013 02:00 - 03:00 | 0 | -1250 | 0 | 0 |
| 26.12.2013 03:00 - 04:00 | 0 | -1250 | 0 | 0 |
| 26.12.2013 04:00 - 05:00 | 0 | -1350 | 0 | 0 |
| 26.12.2013 05:00 - 06:00 | 0 | -1350 | 0 | 0 |
| 26.12.2013 06:00 - 07:00 | 0 | -400 | 0 | 0 |
| 26.12.2013 07:00 - 08:00 | 0 | -400 | 0 | 0 |
| 26.12.2013 08:00 - 09:00 | 0 | -900 | 0 | 0 |
| 26.12.2013 09:00 - 10:00 | 0 | -900 | 0 | 0 |
| 26.12.2013 10:00 - 11:00 | 0 | -900 | 0 | 0 |
| 26.12.2013 11:00 - 12:00 | 0 | -900 | 0 | 0 |
| 26.12.2013 12:00 - 13:00 | 0 | -900 | 0 | 0 |
| 26.12.2013 13:00 - 14:00 | 0 | -900 | 0 | 0 |
| 26.12.2013 14:00 - 15:00 | 0 | -900 | 0 | 0 |
| 26.12.2013 15:00 - 16:00 | 0 | -900 | 0 | 0 |
| 26.12.2013 16:00 - 17:00 | 0 | -900 | 0 | 0 |
| 26.12.2013 17:00 - 18:00 | 0 | -900 | 0 | 0 |
| 26.12.2013 18:00 - 19:00 | 0 | -900 | 0 | 0 |
| 26.12.2013 19:00 - 20:00 | 0 | -900 | 0 | 0 |
| 26.12.2013 20:00 - 21:00 | 0 | -900 | 0 | 0 |
| 26.12.2013 21:00 - 22:00 | 0 | -900 | 0 | 0 |
| 26.12.2013 22:00 - 23:00 | 0 | -900 | 0 | 0 |
| 26.12.2013 23:00 - 24:00 | 0 | -900 | 0 | 0 |
| 27.12.2013 00:00 - 01:00 | 0 | -900 | 0 | 0 |
| 27.12.2013 01:00 - 02:00 | 0 | -900 | 0 | 0 |
| 27.12.2013 02:00 - 03:00 | 0 | -900 | 0 | 0 |
| 27.12.2013 03:00 - 04:00 | 0 | -900 | 0 | 0 |
| 27.12.2013 04:00 - 05:00 | 0 | -900 | 0 | 0 |
| 27.12.2013 05:00 - 06:00 | 0 | -900 | 0 | 0 |
| 27.12.2013 06:00 - 07:00 | 0 | 0 | 0 | 0 |
| 27.12.2013 07:00 - 08:00 | 0 | 0 | 0 | 0 |
| 27.12.2013 08:00 - 09:00 | 0 | 0 | 0 | 0 |
| 27.12.2013 09:00 - 10:00 | 0 | 0 | 0 | 0 |
| 27.12.2013 10:00 - 11:00 | 0 | 0 | 0 | 0 |
| 27.12.2013 11:00 - 12:00 | 0 | 0 | 0 | 0 |
| 27.12.2013 12:00 - 13:00 | 0 | 0 | 0 | 0 |
| 27.12.2013 13:00 - 14:00 | 0 | 0 | 0 | 0 |
| 27.12.2013 14:00 - 15:00 | 0 | 0 | 0 | 0 |
| 27.12.2013 15:00 - 16:00 | 0 | 0 | 0 | 0 |
| 27.12.2013 16:00 - 17:00 | 0 | 0 | 0 | 0 |
| 27.12.2013 17:00 - 18:00 | 0 | -200 | 0 | 0 |
| 27.12.2013 18:00 - 19:00 | 0 | -200 | 0 | 0 |
| 27.12.2013 19:00 - 20:00 | 0 | -200 | 0 | 0 |
| 27.12.2013 20:00 - 21:00 | 0 | -200 | 0 | 0 |
| 27.12.2013 21:00 - 22:00 | 0 | -200 | 0 | 0 |
| 27.12.2013 22:00 - 23:00 | 0 | -900 | 0 | 0 |
| 27.12.2013 23:00 - 24:00 | 0 | -900 | 0 | 0 |
| 28.12.2013 00:00 - 01:00 | 0 | -900 | 0 | 0 |
| 28.12.2013 01:00 - 02:00 | 0 | -900 | 0 | 0 |
| 28.12.2013 02:00 - 03:00 | 0 | -1100 | 0 | 0 |
| 28.12.2013 03:00 - 04:00 | 0 | -1100 | 0 | 0 |
| 28.12.2013 04:00 - 05:00 | 0 | -1100 | 0 | 0 |
| 28.12.2013 05:00 - 06:00 | 0 | -1100 | 0 | 0 |
| 28.12.2013 06:00 - 07:00 | 0 | 0 | 0 | 0 |
| 28.12.2013 07:00 - 08:00 | 0 | 0 | 0 | 0 |
| 28.12.2013 08:00 - 09:00 | 0 | 0 | 0 | 0 |
| 28.12.2013 09:00 - 10:00 | 0 | 0 | 0 | 0 |
| 28.12.2013 10:00 - 11:00 | 0 | 0 | 0 | 0 |
| 28.12.2013 11:00 - 12:00 | 0 | 0 | 0 | 0 |
| 28.12.2013 12:00 - 13:00 | 0 | 0 | 0 | 0 |
| 28.12.2013 13:00 - 14:00 | 0 | -400 | 0 | 0 |
| 28.12.2013 14:00 - 15:00 | 0 | -400 | 0 | 0 |
| 28.12.2013 15:00 - 16:00 | 0 | -400 | 0 | 0 |
| 28.12.2013 16:00 - 17:00 | 0 | -400 | 0 | 0 |
| 28.12.2013 17:00 - 18:00 | 0 | -400 | 0 | 0 |
| 28.12.2013 18:00 - 19:00 | 0 | -400 | 0 | 0 |
| 28.12.2013 19:00 - 20:00 | 0 | -400 | 0 | 0 |
| 28.12.2013 20:00 - 21:00 | 0 | -400 | 0 | 0 |
| 28.12.2013 21:00 - 22:00 | 0 | -400 | 0 | 0 |
| 28.12.2013 22:00 - 23:00 | 0 | -400 | 0 | 0 |
| 28.12.2013 23:00 - 24:00 | 0 | -400 | 0 | 0 |
| 29.12.2013 00:00 - 01:00 | 0 | -400 | 0 | 0 |
| 29.12.2013 01:00 - 02:00 | 0 | -400 | 0 | 0 |
| 29.12.2013 02:00 - 03:00 | 0 | -400 | 0 | 0 |
| 29.12.2013 03:00 - 04:00 | 0 | -400 | 0 | 0 |
| 29.12.2013 04:00 - 05:00 | 0 | -400 | 0 | 0 |
| 29.12.2013 05:00 - 06:00 | 0 | -400 | 0 | 0 |
| 29.12.2013 06:00 - 07:00 | 0 | 0 | 0 | 0 |
| 29.12.2013 07:00 - 08:00 | 0 | 0 | 0 | 0 |
| 29.12.2013 08:00 - 09:00 | 0 | 0 | 0 | 0 |
| 29.12.2013 09:00 - 10:00 | 0 | 0 | 0 | 0 |
| 29.12.2013 10:00 - 11:00 | 0 | 0 | 0 | 0 |
| 29.12.2013 11:00 - 12:00 | 0 | 0 | 0 | 0 |
| 29.12.2013 12:00 - 13:00 | 0 | 0 | 0 | 0 |
| 29.12.2013 13:00 - 14:00 | 0 | 0 | 0 | 0 |
| 29.12.2013 14:00 - 15:00 | 0 | 0 | 0 | 0 |
| 29.12.2013 15:00 - 16:00 | 0 | 0 | 0 | 0 |
| 29.12.2013 16:00 - 17:00 | 0 | -200 | 0 | 0 |
| 29.12.2013 17:00 - 18:00 | 0 | -200 | 0 | 0 |
| 29.12.2013 18:00 - 19:00 | 0 | -600 | 0 | 0 |
| 29.12.2013 19:00 - 20:00 | 0 | -600 | 0 | 0 |
| 29.12.2013 20:00 - 21:00 | 0 | -600 | 0 | 0 |
| 29.12.2013 21:00 - 22:00 | 0 | -600 | 0 | 0 |
| 29.12.2013 22:00 - 23:00 | 0 | -600 | 0 | 0 |
| 29.12.2013 23:00 - 24:00 | 0 | -600 | 0 | 0 |
| 30.12.2013 00:00 - 01:00 | 0 | -600 | 0 | 0 |
| 30.12.2013 01:00 - 02:00 | 0 | -1200 | 0 | 0 |
| 30.12.2013 02:00 - 03:00 | 0 | -1200 | 0 | 0 |
| 30.12.2013 03:00 - 04:00 | 0 | -1700 | 0 | 0 |
| 30.12.2013 04:00 - 05:00 | 0 | -1700 | 0 | 0 |
| 30.12.2013 05:00 - 06:00 | 0 | -1700 | 0 | 0 |
| 30.12.2013 06:00 - 07:00 | 0 | 0 | 0 | 0 |
| 30.12.2013 07:00 - 08:00 | 0 | 0 | 0 | 0 |
| 30.12.2013 08:00 - 09:00 | 0 | 0 | 0 | 0 |
| 30.12.2013 09:00 - 10:00 | 0 | 0 | 0 | 0 |
| 30.12.2013 10:00 - 11:00 | 0 | 0 | 0 | 0 |
| 30.12.2013 11:00 - 12:00 | 0 | 0 | 0 | 0 |
| 30.12.2013 12:00 - 13:00 | 0 | 0 | 0 | 0 |
| 30.12.2013 13:00 - 14:00 | 0 | 0 | 0 | 0 |
| 30.12.2013 14:00 - 15:00 | 0 | 0 | 0 | 0 |
| 30.12.2013 15:00 - 16:00 | 0 | 0 | 0 | 0 |
| 30.12.2013 16:00 - 17:00 | 0 | 0 | 0 | 0 |
| 30.12.2013 17:00 - 18:00 | 0 | 0 | 0 | 0 |
| 30.12.2013 18:00 - 19:00 | 0 | -400 | 0 | 0 |
| 30.12.2013 19:00 - 20:00 | 0 | -400 | 0 | 0 |
| 30.12.2013 20:00 - 21:00 | 0 | -400 | 0 | 0 |
| 30.12.2013 21:00 - 22:00 | 0 | -400 | 0 | 0 |
| 30.12.2013 22:00 - 23:00 | 0 | -600 | 0 | 0 |
| 30.12.2013 23:00 - 24:00 | 0 | -600 | 0 | 0 |
| 31.12.2013 00:00 - 01:00 | 0 | -800 | 0 | 0 |
| 31.12.2013 01:00 - 02:00 | 0 | -800 | 0 | 0 |
| 31.12.2013 02:00 - 03:00 | 0 | -1300 | 0 | 0 |
| 31.12.2013 03:00 - 04:00 | 0 | -1300 | 0 | 0 |
| 31.12.2013 04:00 - 05:00 | 0 | -1300 | 0 | 0 |
| 31.12.2013 05:00 - 06:00 | 0 | -1300 | 0 | 0 |